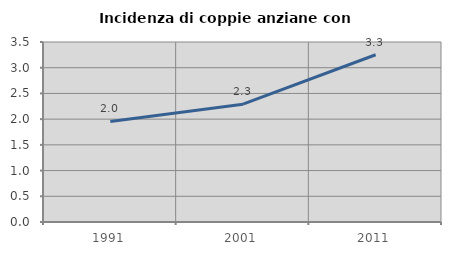
| Category | Incidenza di coppie anziane con figli |
|---|---|
| 1991.0 | 1.955 |
| 2001.0 | 2.291 |
| 2011.0 | 3.252 |